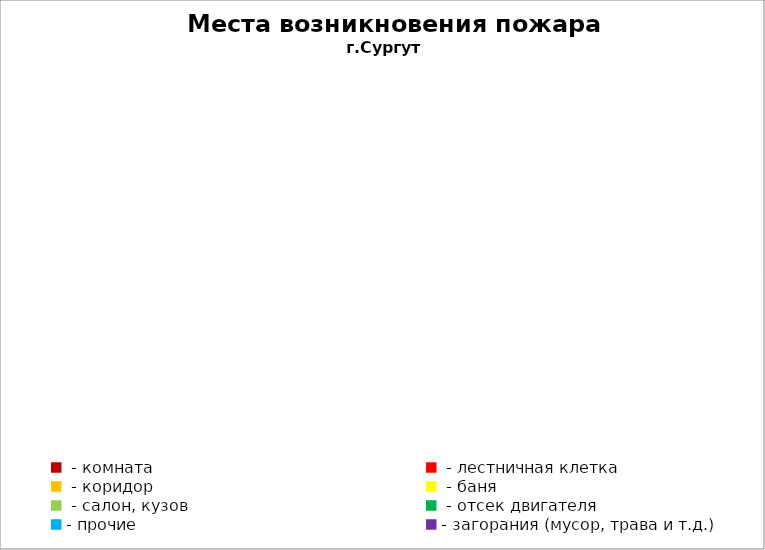
| Category | Места возникновения пожара |
|---|---|
|  - комната | 45 |
|  - лестничная клетка | 22 |
|  - коридор | 3 |
|  - баня | 29 |
|  - салон, кузов | 17 |
|  - отсек двигателя | 24 |
| - прочие | 75 |
| - загорания (мусор, трава и т.д.)  | 154 |